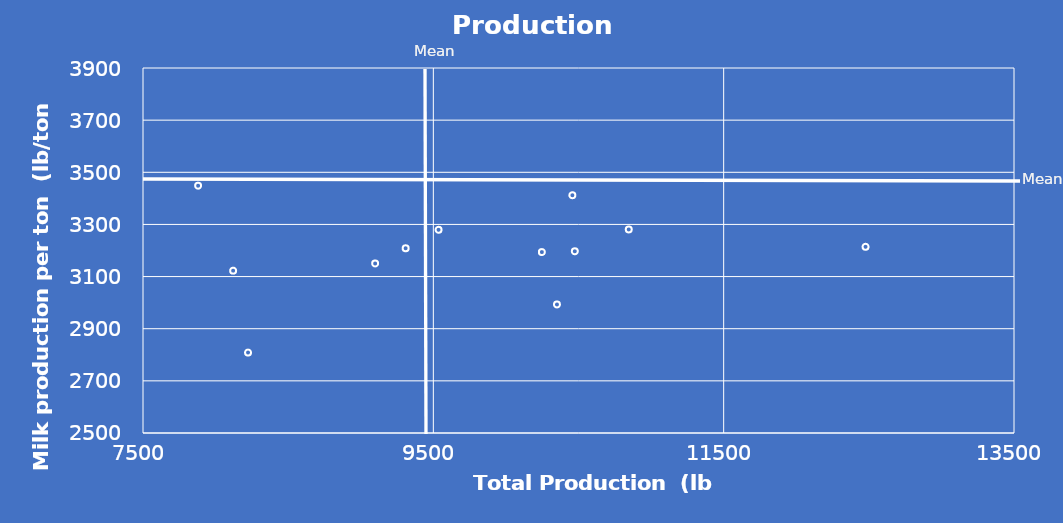
| Category | Series 0 |
|---|---|
| 10474.616031263 | 3197 |
| 10457.613974883 | 3412 |
| 9098.989679841 | 3150.25 |
| 10247.723538092 | 3194 |
| 5220.078065962 | 3213 |
| 9535.980171082 | 3279.5 |
| 10846.17163994 | 3280.75 |
| 10351.537917287 | 2993 |
| 8223.526538824 | 2808.5 |
| 8120.875203803 | 3122.75 |
| 9309.273765799 | 3208.5 |
| 7879.566573149 | 3448.5 |
| 12477.364126391 | 3214.25 |